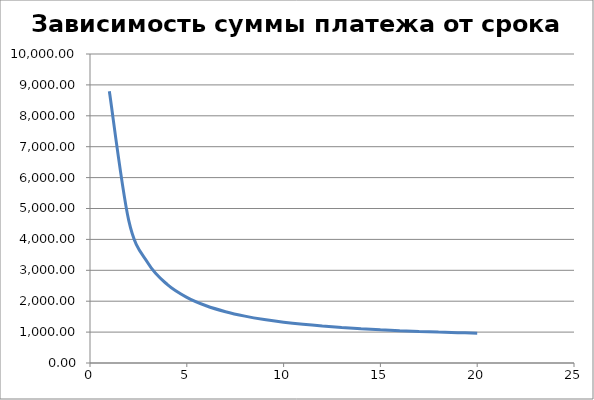
| Category | Платеж |
|---|---|
| 1.0 | 8791.589 |
| 2.0 | 4614.493 |
| 3.0 | 3226.719 |
| 4.0 | 2536.258 |
| 5.0 | 2124.704 |
| 6.0 | 1852.584 |
| 7.0 | 1660.118 |
| 8.0 | 1517.416 |
| 9.0 | 1407.869 |
| 10.0 | 1321.507 |
| 11.0 | 1251.988 |
| 12.0 | 1195.078 |
| 13.0 | 1147.848 |
| 14.0 | 1108.203 |
| 15.0 | 1074.605 |
| 16.0 | 1045.902 |
| 17.0 | 1021.21 |
| 18.0 | 999.844 |
| 19.0 | 981.259 |
| 20.0 | 965.022 |